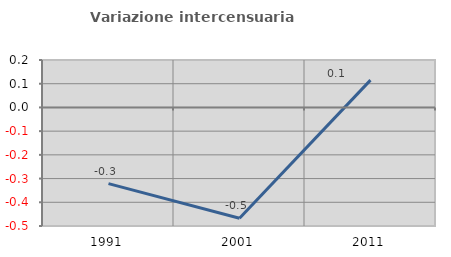
| Category | Variazione intercensuaria annua |
|---|---|
| 1991.0 | -0.321 |
| 2001.0 | -0.468 |
| 2011.0 | 0.115 |